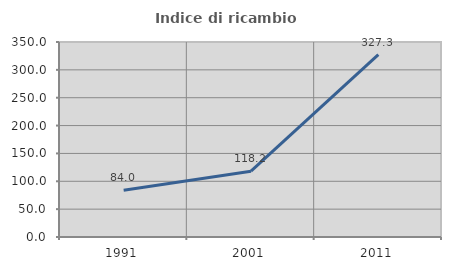
| Category | Indice di ricambio occupazionale  |
|---|---|
| 1991.0 | 84 |
| 2001.0 | 118.182 |
| 2011.0 | 327.273 |